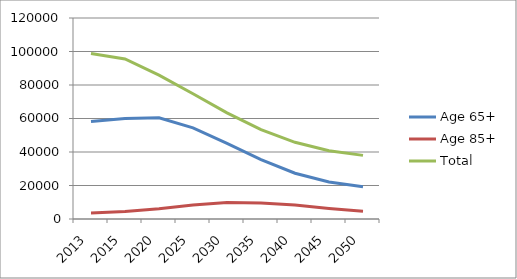
| Category | Age 65+ | Age 85+ | Total |
|---|---|---|---|
| 2013.0 | 58268 | 3610 | 98850 |
| 2015.0 | 59993.26 | 4544.591 | 95573.571 |
| 2020.0 | 60424.565 | 6050.969 | 85921.593 |
| 2025.0 | 54366.036 | 8397.416 | 74797.747 |
| 2030.0 | 45123.026 | 9876.943 | 63344.557 |
| 2035.0 | 35468.183 | 9585.665 | 53381.181 |
| 2040.0 | 27342.704 | 8300.838 | 45776.547 |
| 2045.0 | 22053.175 | 6299.582 | 40785.899 |
| 2050.0 | 19306.728 | 4612.375 | 37977.898 |